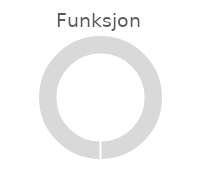
| Category | Funksjon |
|---|---|
| 0 | 0 |
| 1 | 6 |